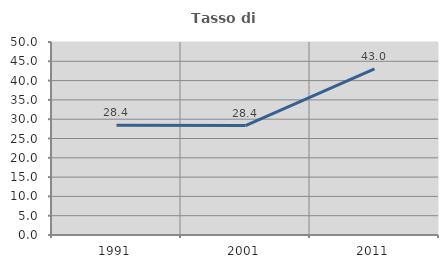
| Category | Tasso di occupazione   |
|---|---|
| 1991.0 | 28.448 |
| 2001.0 | 28.351 |
| 2011.0 | 43.044 |